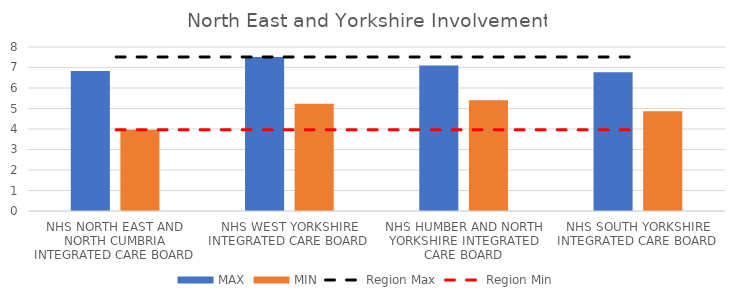
| Category | MAX | MIN |
|---|---|---|
| NHS NORTH EAST AND NORTH CUMBRIA INTEGRATED CARE BOARD | 6.833 | 3.965 |
| NHS WEST YORKSHIRE INTEGRATED CARE BOARD | 7.515 | 5.227 |
| NHS HUMBER AND NORTH YORKSHIRE INTEGRATED CARE BOARD | 7.096 | 5.401 |
| NHS SOUTH YORKSHIRE INTEGRATED CARE BOARD | 6.774 | 4.861 |